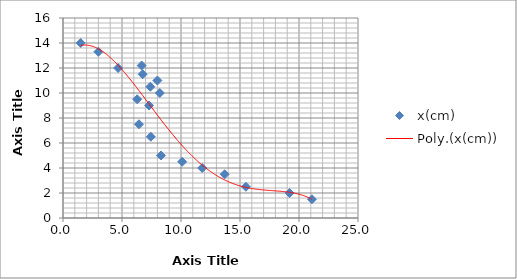
| Category | x(cm) |
|---|---|
| 1.5 | 14 |
| 3.0 | 13.3 |
| 4.67 | 12 |
| 6.67 | 12.2 |
| 6.75 | 11.5 |
| 8.0 | 11 |
| 7.4 | 10.5 |
| 8.2 | 10 |
| 6.29 | 9.5 |
| 7.29 | 9 |
| 6.44 | 7.5 |
| 7.44 | 6.5 |
| 8.3 | 5 |
| 10.1 | 4.5 |
| 11.8 | 4 |
| 13.7 | 3.5 |
| 15.5 | 2.5 |
| 19.2 | 2 |
| 21.1 | 1.5 |